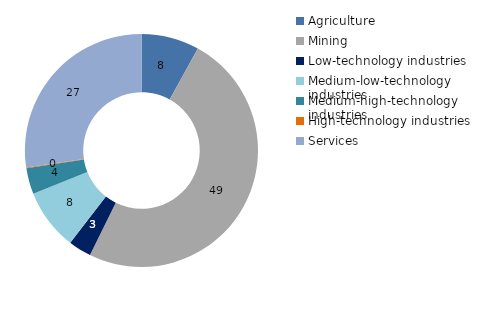
| Category | 2014 |
|---|---|
| Agriculture | 8.038 |
| Mining | 49.254 |
| Low-technology industries | 3.183 |
| Medium-low-technology industries | 8.481 |
| Medium-high-technology industries | 3.608 |
| High-technology industries | 0.098 |
| Services | 27.338 |